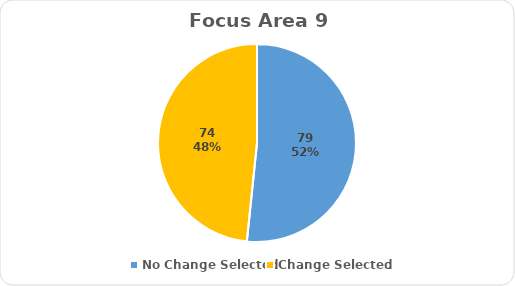
| Category | Series 0 |
|---|---|
| No Change Selected | 79 |
| Change Selected | 74 |